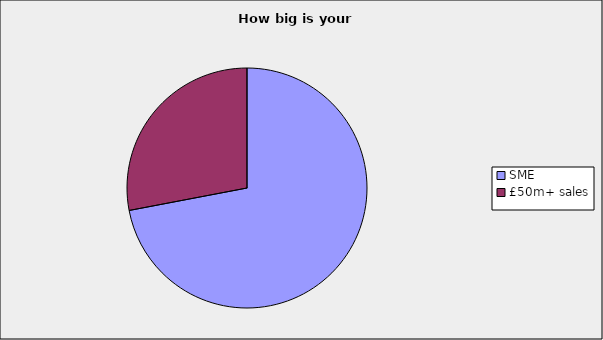
| Category | Series 0 |
|---|---|
| SME | 0.72 |
| £50m+ sales  | 0.28 |